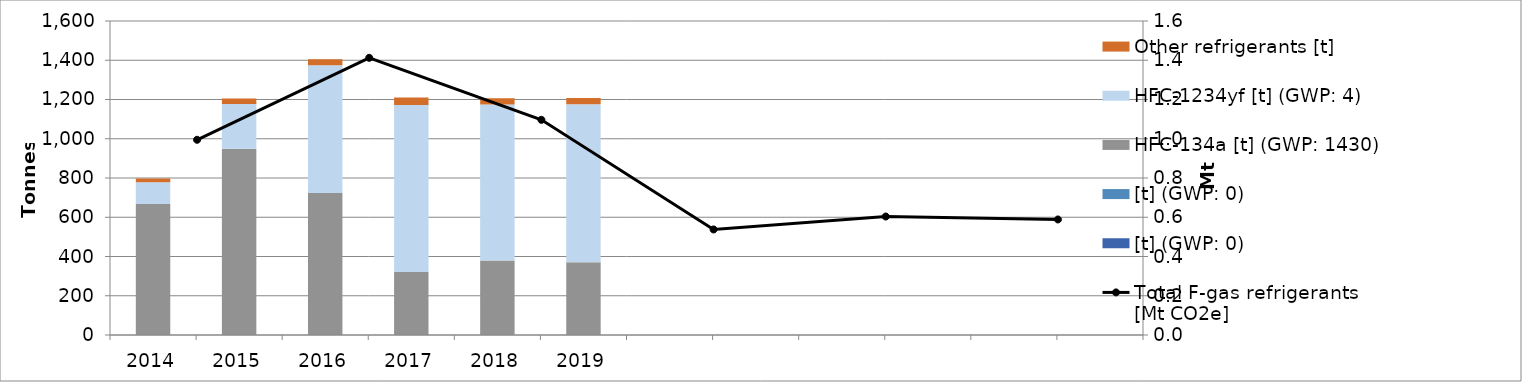
| Category |  [t] (GWP: 0) | HFC-134a [t] (GWP: 1430) | HFC-1234yf [t] (GWP: 4) | Other refrigerants [t] |
|---|---|---|---|---|
| 2014.0 | 0 | 668.108 | 110.155 | 19.677 |
| 2015.0 | 0 | 949.245 | 228.461 | 27.318 |
| 2016.0 | 0 | 723.966 | 650.387 | 30.274 |
| 2017.0 | 0 | 321.602 | 850.539 | 37.916 |
| 2018.0 | 0 | 379.078 | 795.643 | 31.293 |
| 2019.0 | 0 | 370.805 | 804.963 | 32.378 |